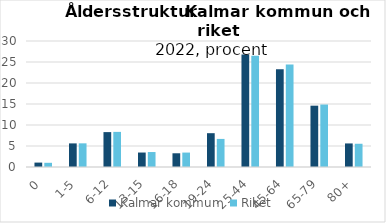
| Category | Kalmar kommun | Riket |
|---|---|---|
| 0 | 1.05 | 1 |
| 1-5 | 5.621 | 5.633 |
| 6-12 | 8.308 | 8.361 |
| 13-15 | 3.445 | 3.564 |
| 16-18 | 3.267 | 3.434 |
| 19-24 | 8.051 | 6.686 |
| 25-44 | 26.785 | 26.515 |
| 45-64 | 23.262 | 24.399 |
| 65-79 | 14.601 | 14.872 |
| 80+ | 5.611 | 5.535 |